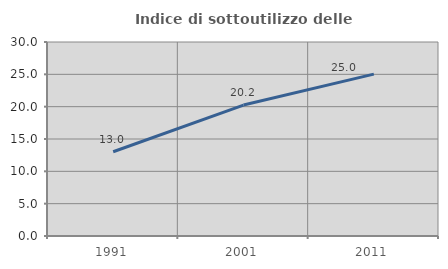
| Category | Indice di sottoutilizzo delle abitazioni  |
|---|---|
| 1991.0 | 13.029 |
| 2001.0 | 20.247 |
| 2011.0 | 25.029 |